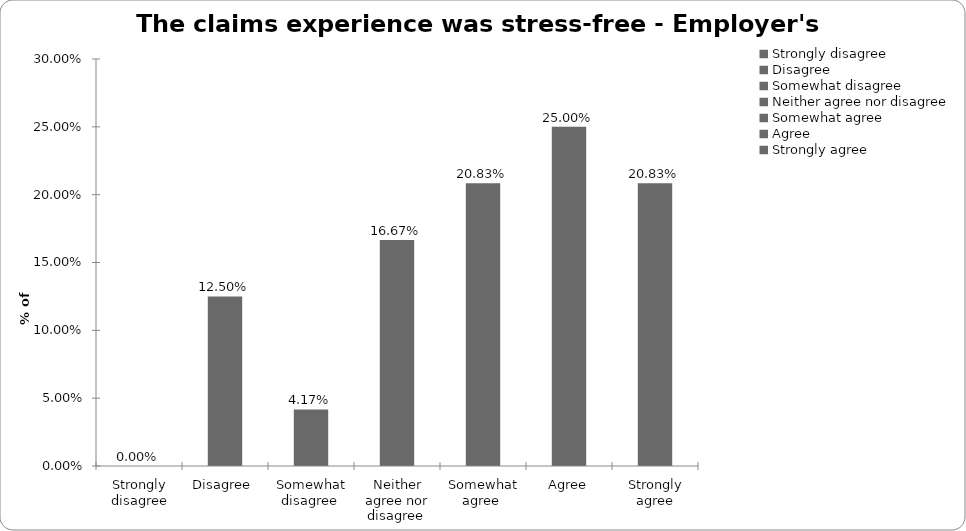
| Category | Series 0 |
|---|---|
| Strongly disagree | 0 |
| Disagree  | 0.125 |
| Somewhat disagree  | 0.042 |
| Neither agree nor disagree  | 0.167 |
| Somewhat agree  | 0.208 |
| Agree | 0.25 |
| Strongly agree | 0.208 |